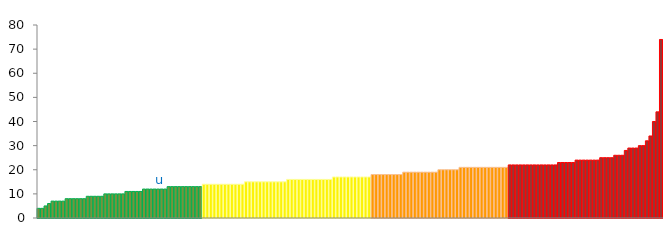
| Category | Top Quartile | 2nd Quartile | 3rd Quartile | Bottom Quartile | Series 4 |
|---|---|---|---|---|---|
|  | 4 | 0 | 0 | 0 | 4 |
|  | 4 | 0 | 0 | 0 | 4 |
|  | 5 | 0 | 0 | 0 | 5 |
|  | 6 | 0 | 0 | 0 | 6 |
|  | 7 | 0 | 0 | 0 | 7 |
|  | 7 | 0 | 0 | 0 | 7 |
|  | 7 | 0 | 0 | 0 | 7 |
|  | 7 | 0 | 0 | 0 | 7 |
|  | 8 | 0 | 0 | 0 | 8 |
|  | 8 | 0 | 0 | 0 | 8 |
|  | 8 | 0 | 0 | 0 | 8 |
|  | 8 | 0 | 0 | 0 | 8 |
|  | 8 | 0 | 0 | 0 | 8 |
|  | 8 | 0 | 0 | 0 | 8 |
|  | 9 | 0 | 0 | 0 | 9 |
|  | 9 | 0 | 0 | 0 | 9 |
|  | 9 | 0 | 0 | 0 | 9 |
|  | 9 | 0 | 0 | 0 | 9 |
|  | 9 | 0 | 0 | 0 | 9 |
|  | 10 | 0 | 0 | 0 | 10 |
|  | 10 | 0 | 0 | 0 | 10 |
|  | 10 | 0 | 0 | 0 | 10 |
|  | 10 | 0 | 0 | 0 | 10 |
|  | 10 | 0 | 0 | 0 | 10 |
|  | 10 | 0 | 0 | 0 | 10 |
|  | 11 | 0 | 0 | 0 | 11 |
|  | 11 | 0 | 0 | 0 | 11 |
|  | 11 | 0 | 0 | 0 | 11 |
|  | 11 | 0 | 0 | 0 | 11 |
|  | 11 | 0 | 0 | 0 | 11 |
|  | 12 | 0 | 0 | 0 | 12 |
|  | 12 | 0 | 0 | 0 | 12 |
|  | 12 | 0 | 0 | 0 | 12 |
|  | 12 | 0 | 0 | 0 | 12 |
|  | 12 | 0 | 0 | 0 | 12 |
| u | 12 | 0 | 0 | 0 | 12 |